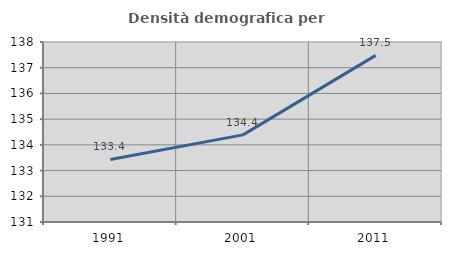
| Category | Densità demografica |
|---|---|
| 1991.0 | 133.434 |
| 2001.0 | 134.389 |
| 2011.0 | 137.48 |